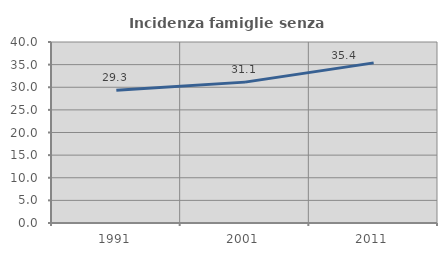
| Category | Incidenza famiglie senza nuclei |
|---|---|
| 1991.0 | 29.314 |
| 2001.0 | 31.132 |
| 2011.0 | 35.388 |